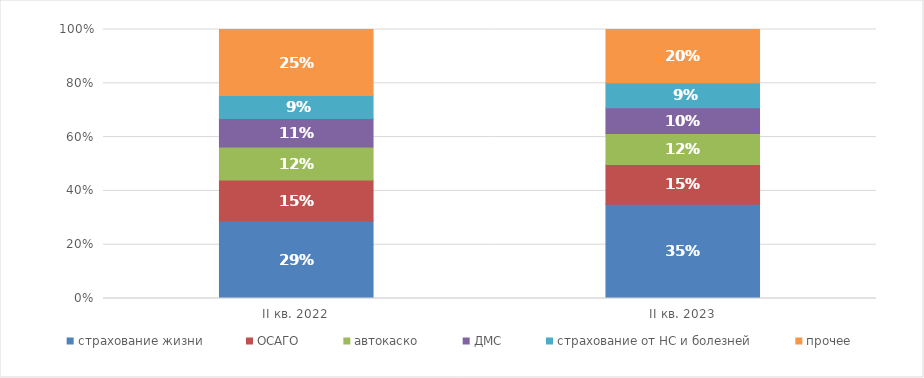
| Category | страхование жизни | ОСАГО | автокаско | ДМС | страхование от НС и болезней | прочее |
|---|---|---|---|---|---|---|
| II кв. 2022 | 0.288 | 0.152 | 0.123 | 0.106 | 0.085 | 0.246 |
| II кв. 2023 | 0.35 | 0.148 | 0.116 | 0.095 | 0.093 | 0.198 |